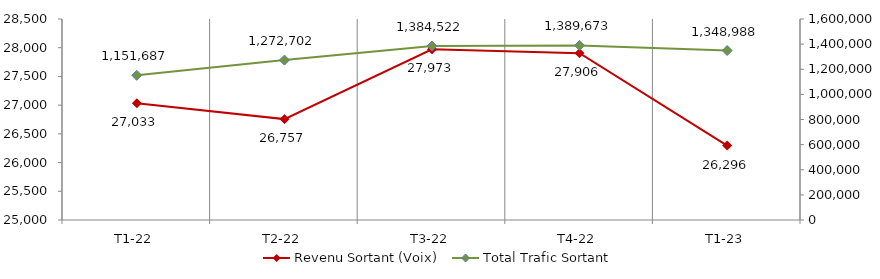
| Category | Revenu Sortant (Voix) |
|---|---|
| T1-22 | 27032.626 |
| T2-22 | 26756.839 |
| T3-22 | 27973.147 |
| T4-22 | 27905.637 |
| T1-23 | 26296.452 |